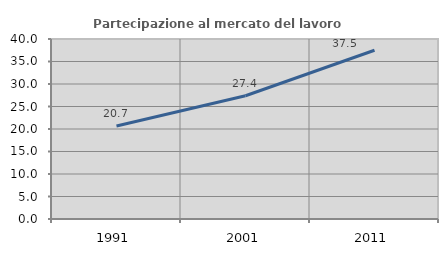
| Category | Partecipazione al mercato del lavoro  femminile |
|---|---|
| 1991.0 | 20.667 |
| 2001.0 | 27.389 |
| 2011.0 | 37.5 |